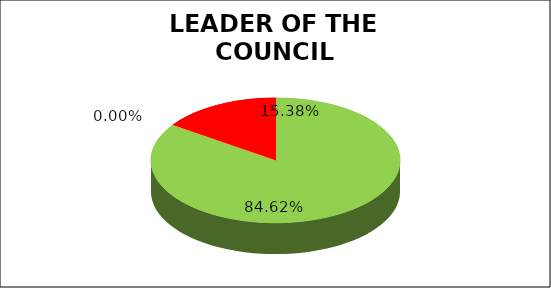
| Category | Q1 |
|---|---|
| Green | 0.846 |
| Amber | 0 |
| Red | 0.154 |